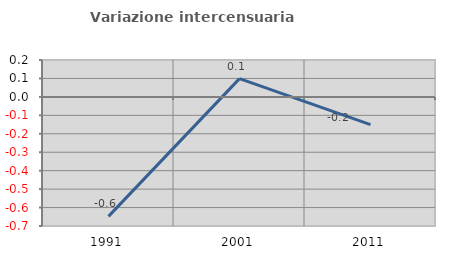
| Category | Variazione intercensuaria annua |
|---|---|
| 1991.0 | -0.648 |
| 2001.0 | 0.099 |
| 2011.0 | -0.15 |